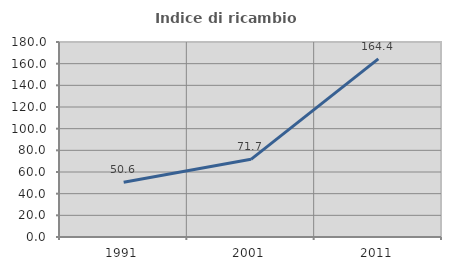
| Category | Indice di ricambio occupazionale  |
|---|---|
| 1991.0 | 50.576 |
| 2001.0 | 71.703 |
| 2011.0 | 164.384 |